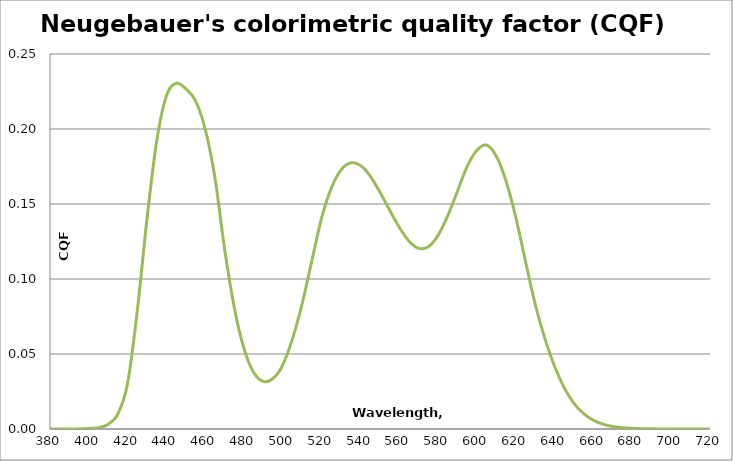
| Category | Series 0 |
|---|---|
| 380.0 | 0 |
| 385.0 | 0 |
| 390.0 | 0 |
| 395.0 | 0 |
| 400.0 | 0 |
| 405.0 | 0.001 |
| 410.0 | 0.003 |
| 415.0 | 0.01 |
| 420.0 | 0.031 |
| 425.0 | 0.079 |
| 430.0 | 0.141 |
| 435.0 | 0.192 |
| 440.0 | 0.222 |
| 445.0 | 0.23 |
| 450.0 | 0.227 |
| 455.0 | 0.219 |
| 460.0 | 0.2 |
| 465.0 | 0.167 |
| 470.0 | 0.12 |
| 475.0 | 0.081 |
| 480.0 | 0.053 |
| 485.0 | 0.037 |
| 490.0 | 0.032 |
| 495.0 | 0.034 |
| 500.0 | 0.043 |
| 505.0 | 0.06 |
| 510.0 | 0.084 |
| 515.0 | 0.113 |
| 520.0 | 0.141 |
| 525.0 | 0.161 |
| 530.0 | 0.173 |
| 535.0 | 0.177 |
| 540.0 | 0.176 |
| 545.0 | 0.169 |
| 550.0 | 0.158 |
| 555.0 | 0.146 |
| 560.0 | 0.134 |
| 565.0 | 0.125 |
| 570.0 | 0.12 |
| 575.0 | 0.122 |
| 580.0 | 0.129 |
| 585.0 | 0.142 |
| 590.0 | 0.159 |
| 595.0 | 0.175 |
| 600.0 | 0.186 |
| 605.0 | 0.189 |
| 610.0 | 0.182 |
| 615.0 | 0.165 |
| 620.0 | 0.141 |
| 625.0 | 0.112 |
| 630.0 | 0.083 |
| 635.0 | 0.06 |
| 640.0 | 0.042 |
| 645.0 | 0.027 |
| 650.0 | 0.017 |
| 655.0 | 0.01 |
| 660.0 | 0.006 |
| 665.0 | 0.003 |
| 670.0 | 0.002 |
| 675.0 | 0.001 |
| 680.0 | 0 |
| 685.0 | 0 |
| 690.0 | 0 |
| 695.0 | 0 |
| 700.0 | 0 |
| 705.0 | 0 |
| 710.0 | 0 |
| 715.0 | 0 |
| 720.0 | 0 |
| 725.0 | 0 |
| 730.0 | 0 |
| 735.0 | 0 |
| 740.0 | 0 |
| 745.0 | 0 |
| 750.0 | 0 |
| 755.0 | 0 |
| 760.0 | 0 |
| 765.0 | 0 |
| 770.0 | 0 |
| 775.0 | 0 |
| 780.0 | 0 |